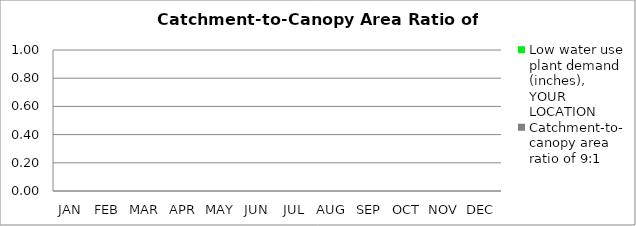
| Category | Low water use plant demand (inches), YOUR LOCATION | Catchment-to-canopy area ratio of 9:1  |
|---|---|---|
| JAN | 0 | 0 |
| FEB | 0 | 0 |
| MAR | 0 | 0 |
| APR | 0 | 0 |
| MAY | 0 | 0 |
| JUN | 0 | 0 |
| JUL | 0 | 0 |
| AUG | 0 | 0 |
| SEP | 0 | 0 |
| OCT | 0 | 0 |
| NOV | 0 | 0 |
| DEC | 0 | 0 |